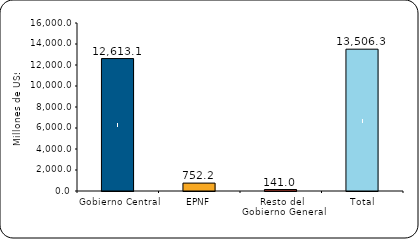
| Category | Series 1 |
|---|---|
| Gobierno Central | 12613.1 |
| EPNF | 752.2 |
| Resto del Gobierno General | 141 |
| Total | 13506.3 |